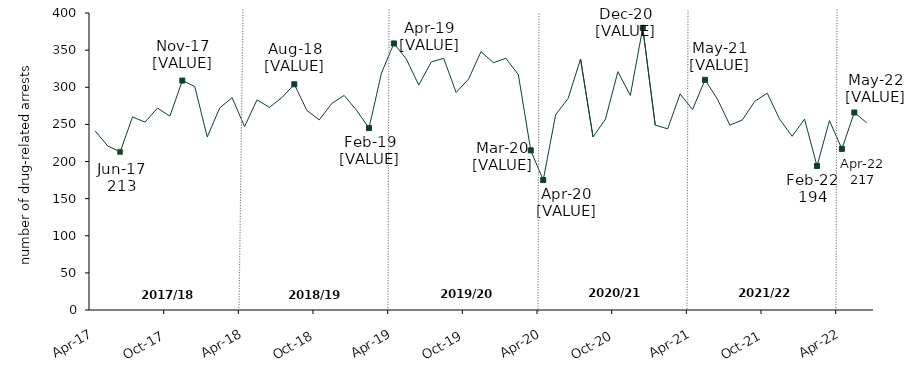
| Category | Number of drug-related arrests |
|---|---|
| 2017-04-01 | 241 |
| 2017-05-01 | 221 |
| 2017-06-01 | 213 |
| 2017-07-01 | 260 |
| 2017-08-01 | 253 |
| 2017-09-01 | 272 |
| 2017-10-01 | 261 |
| 2017-11-01 | 309 |
| 2017-12-01 | 301 |
| 2018-01-01 | 233 |
| 2018-02-01 | 272 |
| 2018-03-01 | 286 |
| 2018-04-01 | 247 |
| 2018-05-01 | 283 |
| 2018-06-01 | 273 |
| 2018-07-01 | 286 |
| 2018-08-01 | 304 |
| 2018-09-01 | 269 |
| 2018-10-01 | 256 |
| 2018-11-01 | 278 |
| 2018-12-01 | 289 |
| 2019-01-01 | 269 |
| 2019-02-01 | 245 |
| 2019-03-01 | 319 |
| 2019-04-01 | 359 |
| 2019-05-01 | 338 |
| 2019-06-01 | 303 |
| 2019-07-01 | 334 |
| 2019-08-01 | 339 |
| 2019-09-01 | 293 |
| 2019-10-01 | 311 |
| 2019-11-01 | 348 |
| 2019-12-01 | 333 |
| 2020-01-01 | 339 |
| 2020-02-01 | 317 |
| 2020-03-01 | 215 |
| 2020-04-01 | 175 |
| 2020-05-01 | 263 |
| 2020-06-01 | 285 |
| 2020-07-01 | 338 |
| 2020-08-01 | 233 |
| 2020-09-01 | 257 |
| 2020-10-01 | 321 |
| 2020-11-01 | 289 |
| 2020-12-01 | 380 |
| 2021-01-01 | 249 |
| 2021-02-01 | 244 |
| 2021-03-01 | 291 |
| 2021-04-01 | 270 |
| 2021-05-01 | 310 |
| 2021-06-01 | 284 |
| 2021-07-01 | 249 |
| 2021-08-01 | 256 |
| 2021-09-01 | 281 |
| 2021-10-01 | 292 |
| 2021-11-01 | 257 |
| 2021-12-01 | 234 |
| 2022-01-01 | 257 |
| 2022-02-01 | 194 |
| 2022-03-01 | 255 |
| 2022-04-01 | 217 |
| 2022-05-01 | 266 |
| 2022-06-01 | 252 |